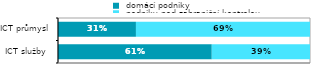
| Category |  domácí podniky |  podniky pod zahraniční kontrolou |
|---|---|---|
| ICT služby  | 0.61 | 0.39 |
| ICT průmysl | 0.309 | 0.691 |